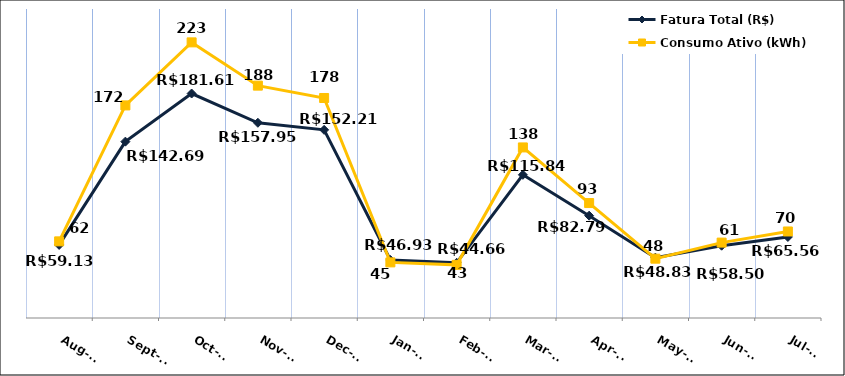
| Category | Fatura Total (R$) |
|---|---|
| 2023-08-01 | 59.13 |
| 2023-09-01 | 142.69 |
| 2023-10-01 | 181.61 |
| 2023-11-01 | 157.95 |
| 2023-12-01 | 152.21 |
| 2024-01-01 | 46.93 |
| 2024-02-01 | 44.66 |
| 2024-03-01 | 115.84 |
| 2024-04-01 | 82.79 |
| 2024-05-01 | 48.83 |
| 2024-06-01 | 58.5 |
| 2024-07-01 | 65.56 |